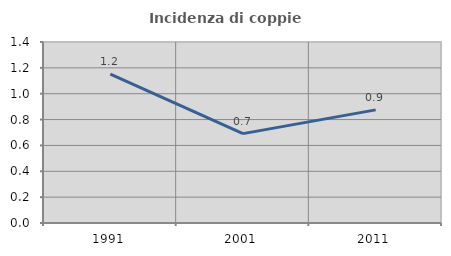
| Category | Incidenza di coppie miste |
|---|---|
| 1991.0 | 1.151 |
| 2001.0 | 0.691 |
| 2011.0 | 0.875 |